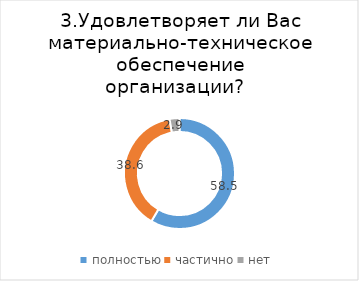
| Category | Series 0 |
|---|---|
| полностью | 58.471 |
| частично | 38.636 |
| нет | 2.893 |